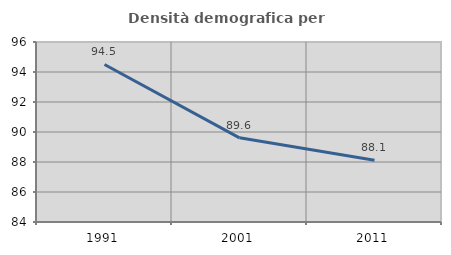
| Category | Densità demografica |
|---|---|
| 1991.0 | 94.503 |
| 2001.0 | 89.612 |
| 2011.0 | 88.122 |